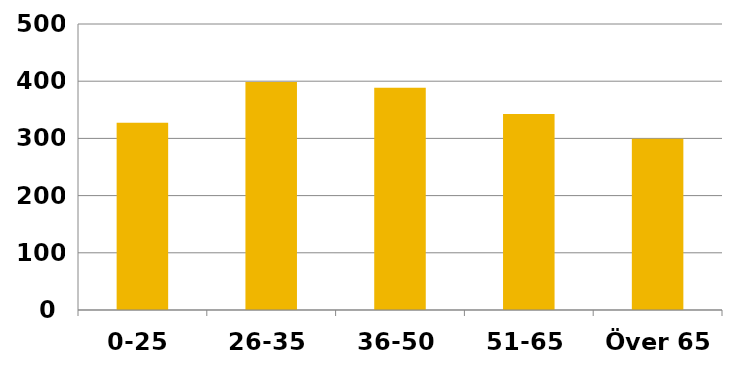
| Category | 2014 |
|---|---|
| 0-25 | 327.169 |
| 26-35 | 398.494 |
| 36-50 | 388.334 |
| 51-65 | 342.624 |
| Över 65 | 299.458 |